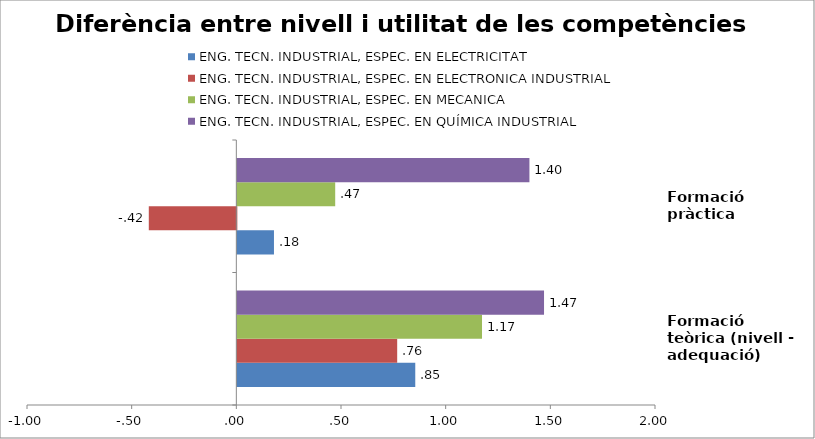
| Category | ENG. TECN. INDUSTRIAL, ESPEC. EN ELECTRICITAT | ENG. TECN. INDUSTRIAL, ESPEC. EN ELECTRONICA INDUSTRIAL | ENG. TECN. INDUSTRIAL, ESPEC. EN MECANICA | ENG. TECN. INDUSTRIAL, ESPEC. EN QUÍMICA INDUSTRIAL |
|---|---|---|---|---|
| Formació teòrica (nivell - adequació) | 0.85 | 0.764 | 1.169 | 1.465 |
| Formació pràctica | 0.175 | -0.418 | 0.468 | 1.395 |